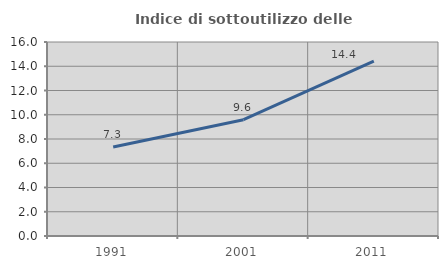
| Category | Indice di sottoutilizzo delle abitazioni  |
|---|---|
| 1991.0 | 7.346 |
| 2001.0 | 9.595 |
| 2011.0 | 14.414 |